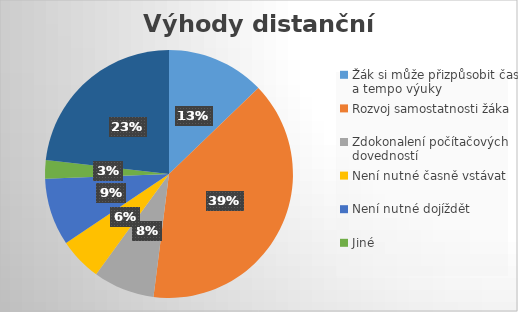
| Category | Series 0 |
|---|---|
| Žák si může přizpůsobit čas a tempo výuky | 16 |
| Rozvoj samostatnosti žáka | 49 |
| Zdokonalení počítačových dovedností | 10 |
| Není nutné časně vstávat | 7 |
| Není nutné dojíždět | 11 |
| Jiné | 3 |
| Žádné | 29 |